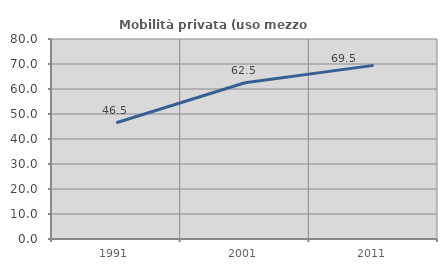
| Category | Mobilità privata (uso mezzo privato) |
|---|---|
| 1991.0 | 46.494 |
| 2001.0 | 62.515 |
| 2011.0 | 69.45 |